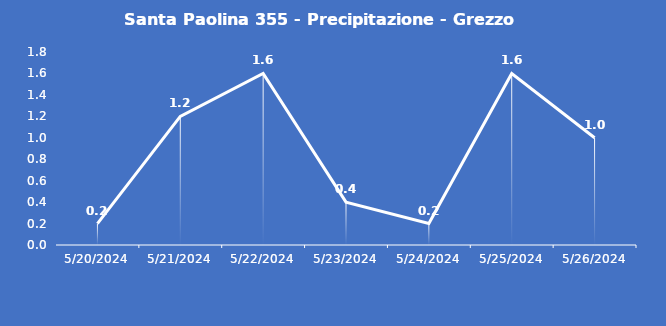
| Category | Santa Paolina 355 - Precipitazione - Grezzo (mm) |
|---|---|
| 5/20/24 | 0.2 |
| 5/21/24 | 1.2 |
| 5/22/24 | 1.6 |
| 5/23/24 | 0.4 |
| 5/24/24 | 0.2 |
| 5/25/24 | 1.6 |
| 5/26/24 | 1 |